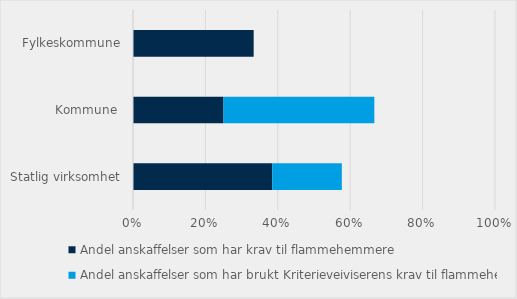
| Category | Andel anskaffelser som har krav til flammehemmere | Andel anskaffelser som har brukt Kriterieveiviserens krav til flammehemmere |
|---|---|---|
| Statlig virksomhet | 0.385 | 0.192 |
| Kommune  | 0.25 | 0.417 |
| Fylkeskommune | 0.333 | 0 |